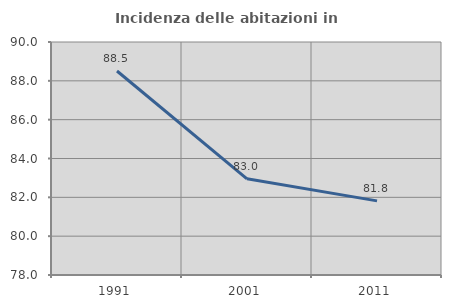
| Category | Incidenza delle abitazioni in proprietà  |
|---|---|
| 1991.0 | 88.506 |
| 2001.0 | 82.955 |
| 2011.0 | 81.818 |